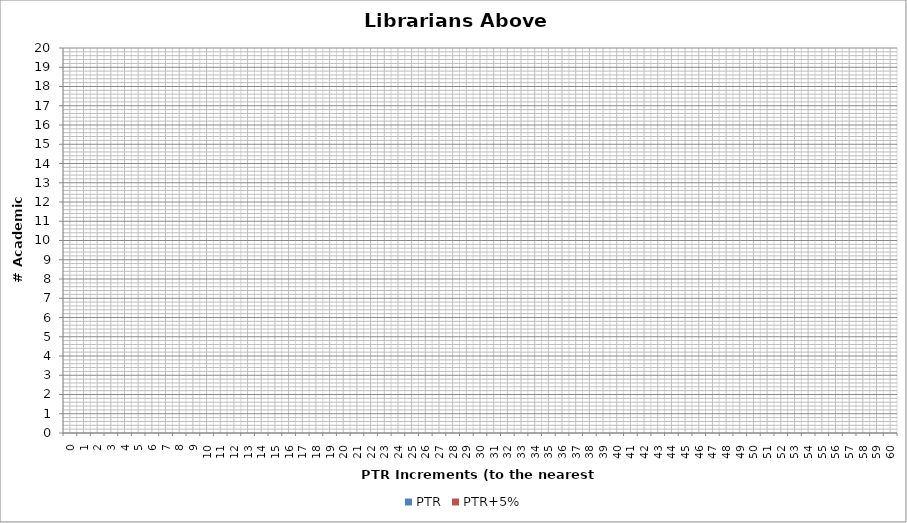
| Category | PTR | PTR+5% |
|---|---|---|
| 0.0 | 0 | 0 |
| 1.0 | 0 | 0 |
| 2.0 | 0 | 0 |
| 3.0 | 0 | 0 |
| 4.0 | 0 | 0 |
| 5.0 | 0 | 0 |
| 6.0 | 0 | 0 |
| 7.0 | 0 | 0 |
| 8.0 | 0 | 0 |
| 9.0 | 0 | 0 |
| 10.0 | 0 | 0 |
| 11.0 | 0 | 0 |
| 12.0 | 0 | 0 |
| 13.0 | 0 | 0 |
| 14.0 | 0 | 0 |
| 15.0 | 0 | 0 |
| 16.0 | 0 | 0 |
| 17.0 | 0 | 0 |
| 18.0 | 0 | 0 |
| 19.0 | 0 | 0 |
| 20.0 | 0 | 0 |
| 21.0 | 0 | 0 |
| 22.0 | 0 | 0 |
| 23.0 | 0 | 0 |
| 24.0 | 0 | 0 |
| 25.0 | 0 | 0 |
| 26.0 | 0 | 0 |
| 27.0 | 0 | 0 |
| 28.0 | 0 | 0 |
| 29.0 | 0 | 0 |
| 30.0 | 0 | 0 |
| 31.0 | 0 | 0 |
| 32.0 | 0 | 0 |
| 33.0 | 0 | 0 |
| 34.0 | 0 | 0 |
| 35.0 | 0 | 0 |
| 36.0 | 0 | 0 |
| 37.0 | 0 | 0 |
| 38.0 | 0 | 0 |
| 39.0 | 0 | 0 |
| 40.0 | 0 | 0 |
| 41.0 | 0 | 0 |
| 42.0 | 0 | 0 |
| 43.0 | 0 | 0 |
| 44.0 | 0 | 0 |
| 45.0 | 0 | 0 |
| 46.0 | 0 | 0 |
| 47.0 | 0 | 0 |
| 48.0 | 0 | 0 |
| 49.0 | 0 | 0 |
| 50.0 | 0 | 0 |
| 51.0 | 0 | 0 |
| 52.0 | 0 | 0 |
| 53.0 | 0 | 0 |
| 54.0 | 0 | 0 |
| 55.0 | 0 | 0 |
| 56.0 | 0 | 0 |
| 57.0 | 0 | 0 |
| 58.0 | 0 | 0 |
| 59.0 | 0 | 0 |
| 60.0 | 0 | 0 |